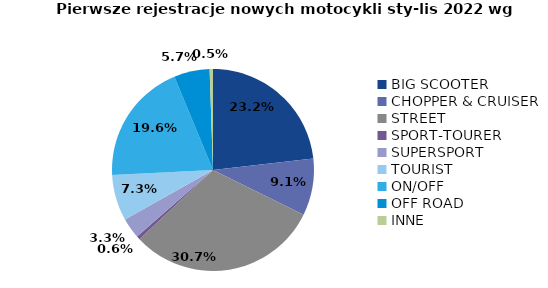
| Category | Series 0 |
|---|---|
| 0 | 5548 |
| 1 | 2176 |
| 2 | 7339 |
| 3 | 132 |
| 4 | 789 |
| 5 | 1756 |
| 6 | 4678 |
| 7 | 1364 |
| 8 | 128 |